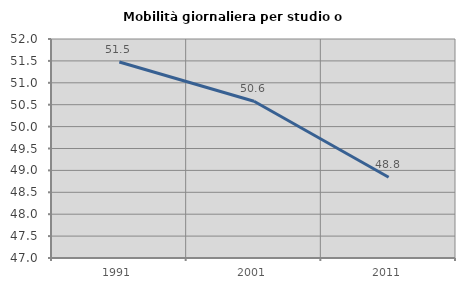
| Category | Mobilità giornaliera per studio o lavoro |
|---|---|
| 1991.0 | 51.475 |
| 2001.0 | 50.578 |
| 2011.0 | 48.844 |